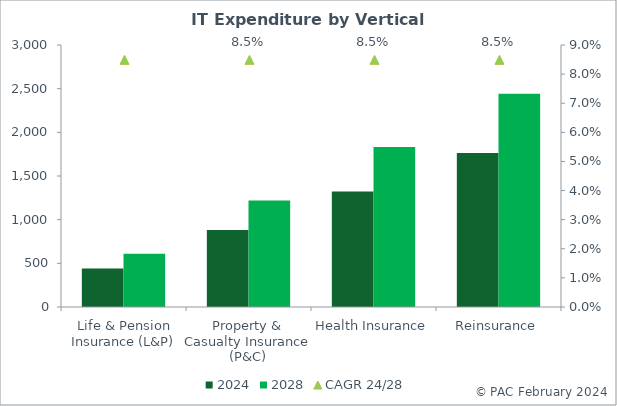
| Category | 2024 | 2028 |
|---|---|---|
| Life & Pension Insurance (L&P) | 440.539 | 610.292 |
| Property & Casualty Insurance (P&C) | 881.079 | 1220.584 |
| Health Insurance | 1321.618 | 1830.876 |
| Reinsurance | 1762.157 | 2441.168 |